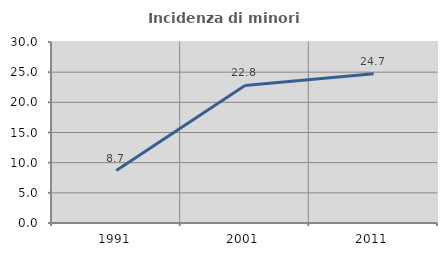
| Category | Incidenza di minori stranieri |
|---|---|
| 1991.0 | 8.696 |
| 2001.0 | 22.794 |
| 2011.0 | 24.719 |